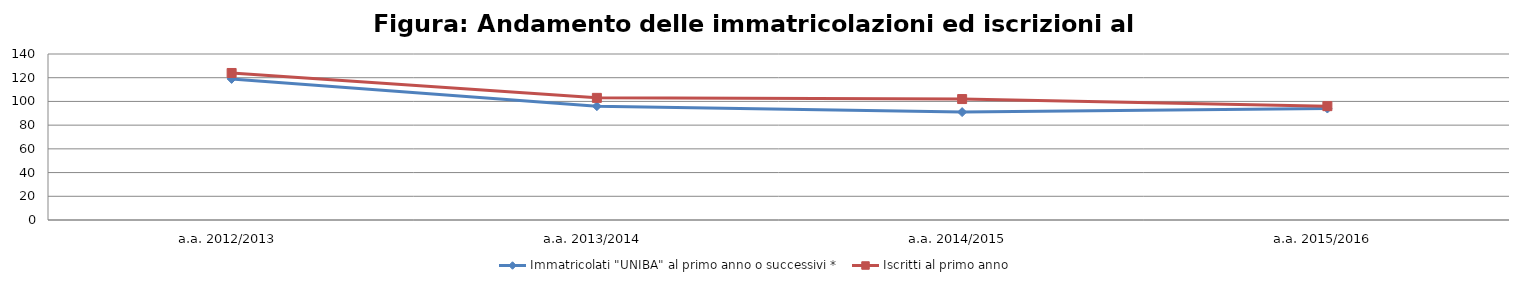
| Category | Immatricolati "UNIBA" al primo anno o successivi * | Iscritti al primo anno  |
|---|---|---|
| a.a. 2012/2013 | 119 | 124 |
| a.a. 2013/2014 | 96 | 103 |
| a.a. 2014/2015 | 91 | 102 |
| a.a. 2015/2016 | 94 | 96 |